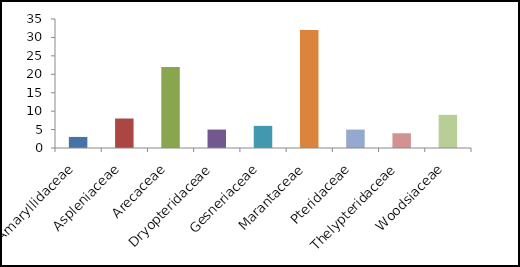
| Category | Quantidade |
|---|---|
| Amaryllidaceae | 3 |
| Aspleniaceae | 8 |
| Arecaceae | 22 |
| Dryopteridaceae | 5 |
| Gesneriaceae | 6 |
| Marantaceae | 32 |
| Pteridaceae | 5 |
| Thelypteridaceae | 4 |
| Woodsiaceae | 9 |